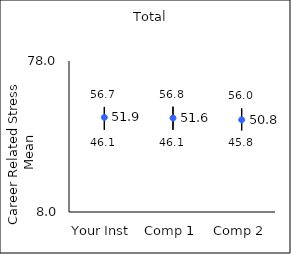
| Category | 25th percentile | 75th percentile | Mean |
|---|---|---|---|
| Your Inst | 46.1 | 56.7 | 51.86 |
| Comp 1 | 46.1 | 56.8 | 51.55 |
| Comp 2 | 45.8 | 56 | 50.75 |